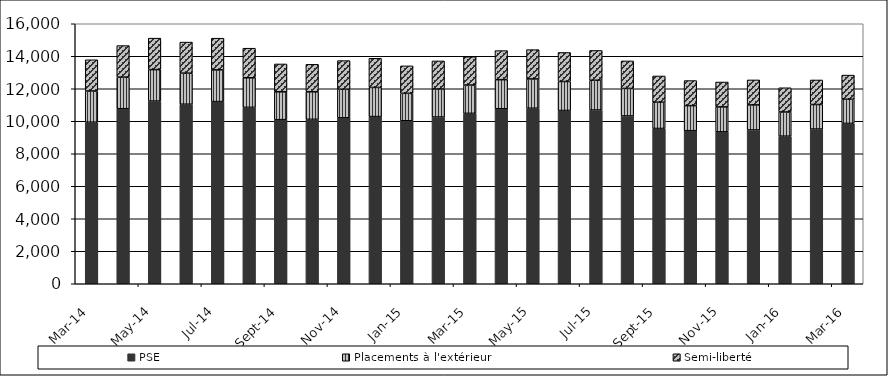
| Category | PSE | Placements à l'extérieur | Semi-liberté |
|---|---|---|---|
| 2014-03-01 | 9943 | 1920 | 1920 |
| 2014-04-01 | 10773 | 1942 | 1942 |
| 2014-05-01 | 11241 | 1937 | 1937 |
| 2014-06-01 | 11048 | 1912 | 1912 |
| 2014-07-01 | 11210 | 1951 | 1951 |
| 2014-08-01 | 10856 | 1820 | 1820 |
| 2014-09-01 | 10098 | 1714 | 1714 |
| 2014-10-01 | 10120 | 1692 | 1692 |
| 2014-11-01 | 10213 | 1760 | 1760 |
| 2014-12-01 | 10287 | 1794 | 1794 |
| 2015-01-01 | 10030 | 1689 | 1689 |
| 2015-02-01 | 10261 | 1726 | 1726 |
| 2015-03-01 | 10485 | 1742 | 1742 |
| 2015-04-01 | 10770 | 1789 | 1789 |
| 2015-05-01 | 10801 | 1803 | 1803 |
| 2015-06-01 | 10662 | 1785 | 1785 |
| 2015-07-01 | 10692 | 1832 | 1832 |
| 2015-08-01 | 10325 | 1694 | 1694 |
| 2015-09-01 | 9555 | 1616 | 1616 |
| 2015-10-01 | 9420 | 1542 | 1542 |
| 2015-11-01 | 9350 | 1533 | 1533 |
| 2015-12-01 | 9466 | 1539 | 1539 |
| 2016-01-01 | 9081 | 1490 | 1490 |
| 2016-02-01 | 9521 | 1510 | 1510 |
| 2016-03-01 | 9868 | 1486 | 1486 |